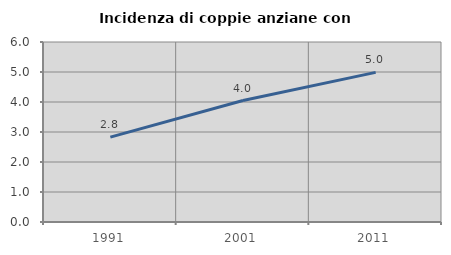
| Category | Incidenza di coppie anziane con figli |
|---|---|
| 1991.0 | 2.831 |
| 2001.0 | 4.049 |
| 2011.0 | 4.987 |